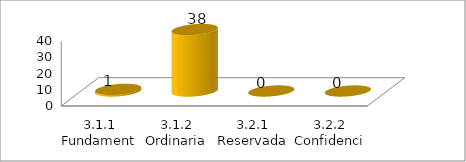
| Category | Series 0 |
|---|---|
| 3.1.1 Fundamental | 1 |
| 3.1.2 Ordinaria | 38 |
| 3.2.1 Reservada | 0 |
| 3.2.2 Confidencial | 0 |